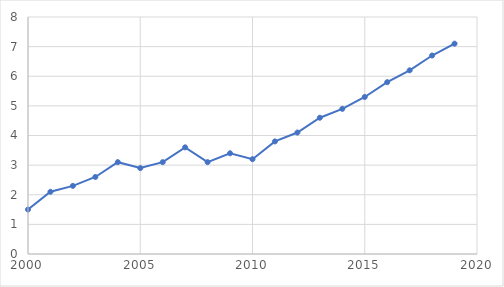
| Category | Series 0 |
|---|---|
| 2000.0 | 1.5 |
| 2001.0 | 2.1 |
| 2002.0 | 2.3 |
| 2003.0 | 2.6 |
| 2004.0 | 3.1 |
| 2005.0 | 2.9 |
| 2006.0 | 3.1 |
| 2007.0 | 3.6 |
| 2008.0 | 3.1 |
| 2009.0 | 3.4 |
| 2010.0 | 3.2 |
| 2011.0 | 3.8 |
| 2012.0 | 4.1 |
| 2013.0 | 4.6 |
| 2014.0 | 4.9 |
| 2015.0 | 5.3 |
| 2016.0 | 5.8 |
| 2017.0 | 6.2 |
| 2018.0 | 6.7 |
| 2019.0 | 7.1 |